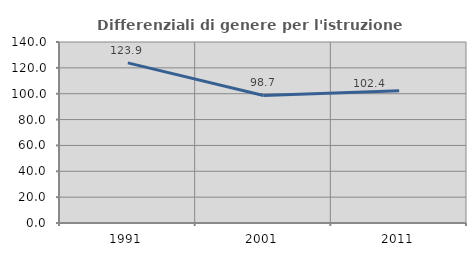
| Category | Differenziali di genere per l'istruzione superiore |
|---|---|
| 1991.0 | 123.869 |
| 2001.0 | 98.667 |
| 2011.0 | 102.367 |